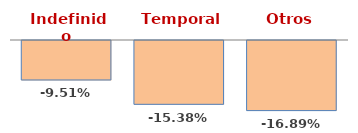
| Category | Series 0 |
|---|---|
| Indefinido | -0.095 |
| Temporal | -0.154 |
| Otros | -0.169 |